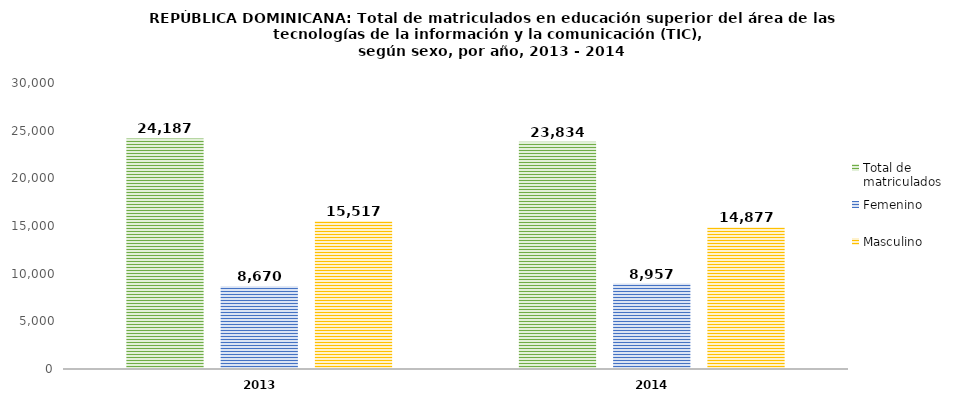
| Category | Total de matriculados | Femenino | Masculino |
|---|---|---|---|
| 2013.0 | 24187 | 8670 | 15517 |
| 2014.0 | 23834 | 8957 | 14877 |